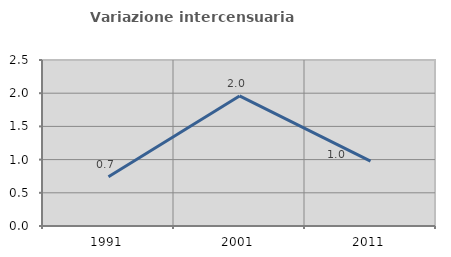
| Category | Variazione intercensuaria annua |
|---|---|
| 1991.0 | 0.743 |
| 2001.0 | 1.958 |
| 2011.0 | 0.978 |